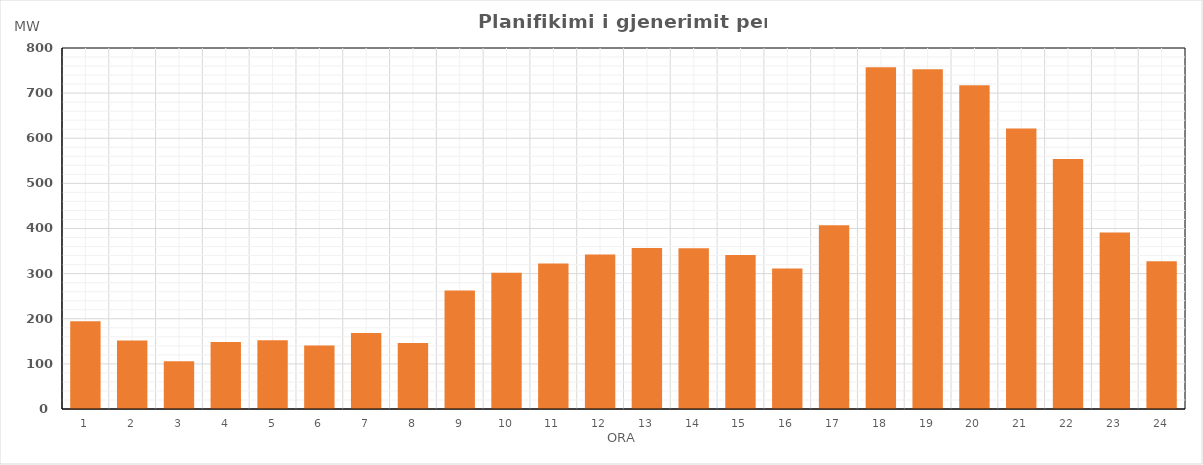
| Category | Max (MW) |
|---|---|
| 0 | 194.567 |
| 1 | 151.828 |
| 2 | 105.641 |
| 3 | 148.207 |
| 4 | 152.451 |
| 5 | 140.758 |
| 6 | 168.359 |
| 7 | 146.059 |
| 8 | 262.704 |
| 9 | 301.777 |
| 10 | 322.316 |
| 11 | 342.485 |
| 12 | 356.892 |
| 13 | 356.364 |
| 14 | 341.049 |
| 15 | 311.604 |
| 16 | 407.303 |
| 17 | 757.318 |
| 18 | 752.802 |
| 19 | 717.369 |
| 20 | 621.876 |
| 21 | 554.024 |
| 22 | 391.378 |
| 23 | 327.225 |